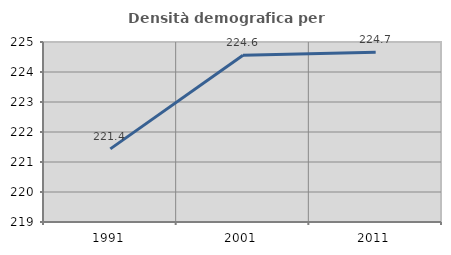
| Category | Densità demografica |
|---|---|
| 1991.0 | 221.437 |
| 2001.0 | 224.556 |
| 2011.0 | 224.655 |